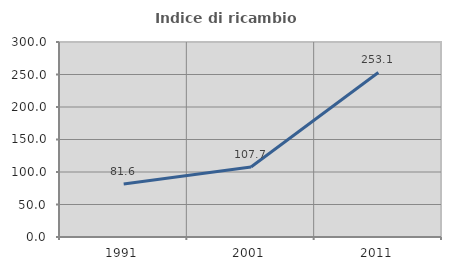
| Category | Indice di ricambio occupazionale  |
|---|---|
| 1991.0 | 81.633 |
| 2001.0 | 107.692 |
| 2011.0 | 253.086 |